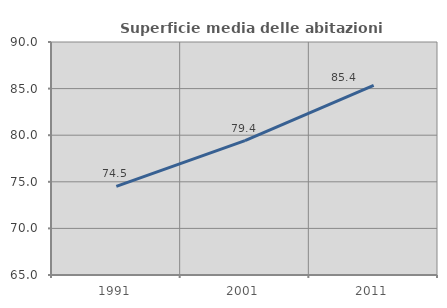
| Category | Superficie media delle abitazioni occupate |
|---|---|
| 1991.0 | 74.515 |
| 2001.0 | 79.418 |
| 2011.0 | 85.358 |